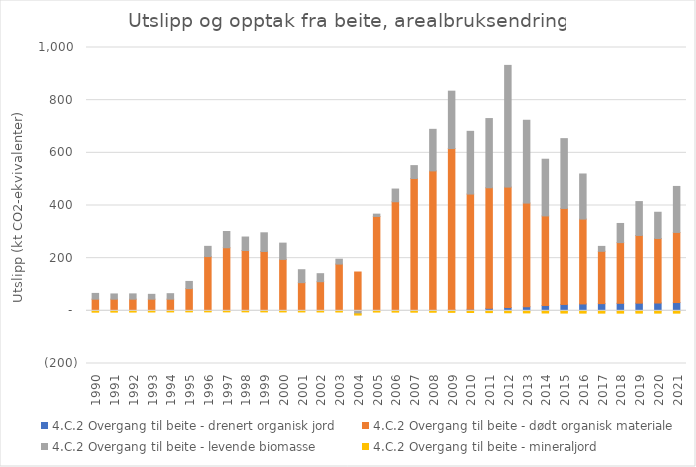
| Category | 4.C.2 Overgang til beite - drenert organisk jord | 4.C.2 Overgang til beite - dødt organisk materiale | 4.C.2 Overgang til beite - levende biomasse | 4.C.2 Overgang til beite - mineraljord |
|---|---|---|---|---|
| 1990.0 | 0 | 44.267 | 21.89 | -5.164 |
| 1991.0 | 0 | 44.267 | 19.871 | -4.934 |
| 1992.0 | 0 | 44.267 | 20.135 | -4.704 |
| 1993.0 | 0 | 44.267 | 18.379 | -4.474 |
| 1994.0 | 0 | 44.267 | 20.864 | -4.244 |
| 1995.0 | 0 | 84.397 | 27.279 | -4.069 |
| 1996.0 | 0 | 206.137 | 38.75 | -4.003 |
| 1997.0 | 0 | 239.578 | 61.697 | -3.992 |
| 1998.0 | 0 | 229.128 | 51.155 | -3.965 |
| 1999.0 | 0 | 225.409 | 70.921 | -4.131 |
| 2000.0 | 0 | 195.311 | 61.813 | -4.254 |
| 2001.0 | 0 | 107.014 | 49.124 | -4.318 |
| 2002.0 | 0 | 110.649 | 30.428 | -4.384 |
| 2003.0 | 0 | 177.533 | 18.567 | -4.553 |
| 2004.0 | 0 | 147.435 | -11.572 | -4.505 |
| 2005.0 | 0 | 358.483 | 8.737 | -4.695 |
| 2006.0 | 0 | 414.197 | 48.273 | -4.925 |
| 2007.0 | 1.428 | 501.133 | 48.891 | -5.168 |
| 2008.0 | 2.855 | 528.561 | 157.817 | -5.411 |
| 2009.0 | 4.283 | 612.007 | 217.864 | -5.793 |
| 2010.0 | 5.71 | 437.746 | 238.175 | -6.276 |
| 2011.0 | 9.517 | 457.811 | 262.846 | -6.799 |
| 2012.0 | 12.61 | 457.342 | 462.121 | -7.373 |
| 2013.0 | 15.703 | 393.465 | 314.482 | -7.863 |
| 2014.0 | 19.986 | 340.453 | 215.315 | -8.242 |
| 2015.0 | 24.269 | 364.53 | 265.124 | -8.524 |
| 2016.0 | 26.172 | 322.193 | 171.32 | -8.673 |
| 2017.0 | 27.362 | 198.649 | 18.699 | -8.703 |
| 2018.0 | 28.551 | 230.587 | 72.627 | -8.79 |
| 2019.0 | 29.146 | 257.093 | 128.672 | -8.741 |
| 2020.0 | 29.741 | 245.055 | 99.535 | -8.755 |
| 2021.0 | 31.525 | 266.224 | 174.63 | -8.84 |